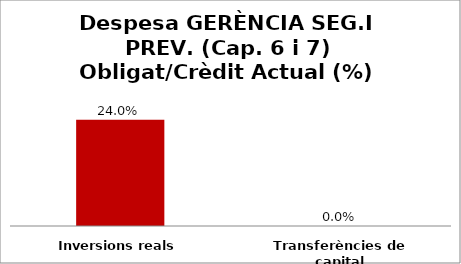
| Category | Series 0 |
|---|---|
| Inversions reals | 0.24 |
| Transferències de capital | 0 |